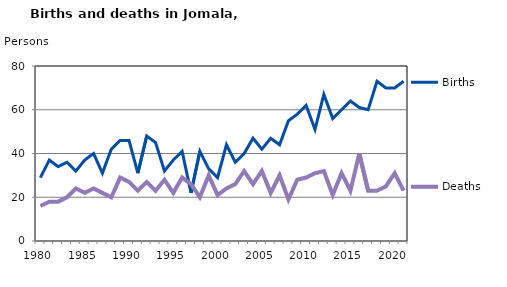
| Category | Births | Deaths |
|---|---|---|
| 1980.0 | 29 | 16 |
| 1981.0 | 37 | 18 |
| 1982.0 | 34 | 18 |
| 1983.0 | 36 | 20 |
| 1984.0 | 32 | 24 |
| 1985.0 | 37 | 22 |
| 1986.0 | 40 | 24 |
| 1987.0 | 31 | 22 |
| 1988.0 | 42 | 20 |
| 1989.0 | 46 | 29 |
| 1990.0 | 46 | 27 |
| 1991.0 | 31 | 23 |
| 1992.0 | 48 | 27 |
| 1993.0 | 45 | 23 |
| 1994.0 | 32 | 28 |
| 1995.0 | 37 | 22 |
| 1996.0 | 41 | 29 |
| 1997.0 | 22 | 26 |
| 1998.0 | 41 | 20 |
| 1999.0 | 33 | 30 |
| 2000.0 | 29 | 21 |
| 2001.0 | 44 | 24 |
| 2002.0 | 36 | 26 |
| 2003.0 | 40 | 32 |
| 2004.0 | 47 | 26 |
| 2005.0 | 42 | 32 |
| 2006.0 | 47 | 22 |
| 2007.0 | 44 | 30 |
| 2008.0 | 55 | 19 |
| 2009.0 | 58 | 28 |
| 2010.0 | 62 | 29 |
| 2011.0 | 51 | 31 |
| 2012.0 | 67 | 32 |
| 2013.0 | 56 | 21 |
| 2014.0 | 60 | 31 |
| 2015.0 | 64 | 23 |
| 2016.0 | 61 | 40 |
| 2017.0 | 60 | 23 |
| 2018.0 | 73 | 23 |
| 2019.0 | 70 | 25 |
| 2020.0 | 70 | 31 |
| 2021.0 | 73 | 23 |